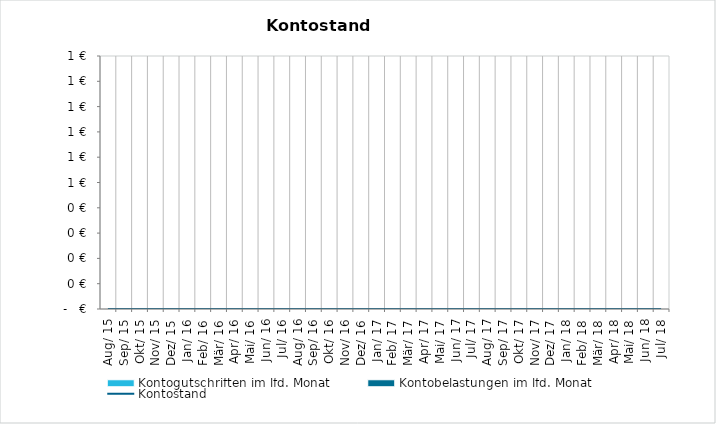
| Category | Kontogutschriften im lfd. Monat | Kontobelastungen im lfd. Monat |
|---|---|---|
| 2015-08-01 | 0 | 0 |
| 2015-09-01 | 0 | 0 |
| 2015-10-01 | 0 | 0 |
| 2015-11-01 | 0 | 0 |
| 2015-12-01 | 0 | 0 |
| 2016-01-01 | 0 | 0 |
| 2016-02-01 | 0 | 0 |
| 2016-03-01 | 0 | 0 |
| 2016-04-01 | 0 | 0 |
| 2016-05-01 | 0 | 0 |
| 2016-06-01 | 0 | 0 |
| 2016-07-01 | 0 | 0 |
| 2016-08-01 | 0 | 0 |
| 2016-09-01 | 0 | 0 |
| 2016-10-01 | 0 | 0 |
| 2016-11-01 | 0 | 0 |
| 2016-12-01 | 0 | 0 |
| 2017-01-01 | 0 | 0 |
| 2017-02-01 | 0 | 0 |
| 2017-03-01 | 0 | 0 |
| 2017-04-01 | 0 | 0 |
| 2017-05-01 | 0 | 0 |
| 2017-06-01 | 0 | 0 |
| 2017-07-01 | 0 | 0 |
| 2017-08-01 | 0 | 0 |
| 2017-09-01 | 0 | 0 |
| 2017-10-01 | 0 | 0 |
| 2017-11-01 | 0 | 0 |
| 2017-12-01 | 0 | 0 |
| 2018-01-01 | 0 | 0 |
| 2018-02-01 | 0 | 0 |
| 2018-03-01 | 0 | 0 |
| 2018-04-01 | 0 | 0 |
| 2018-05-01 | 0 | 0 |
| 2018-06-01 | 0 | 0 |
| 2018-07-01 | 0 | 0 |